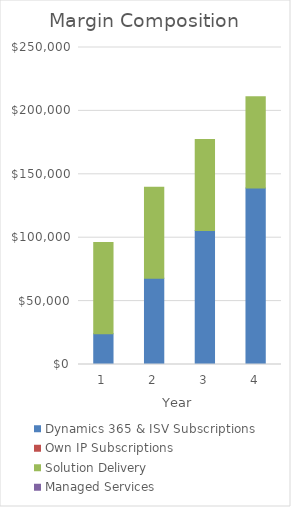
| Category | Dynamics 365 & ISV Subscriptions | Own IP Subscriptions | Solution Delivery | Managed Services |
|---|---|---|---|---|
| 1.0 | 24305.32 | 0 | 71900 | 0 |
| 2.0 | 67961.414 | 0 | 71900 | 0 |
| 3.0 | 105609.686 | 0 | 71900 | 0 |
| 4.0 | 139293.494 | 0 | 71900 | 0 |